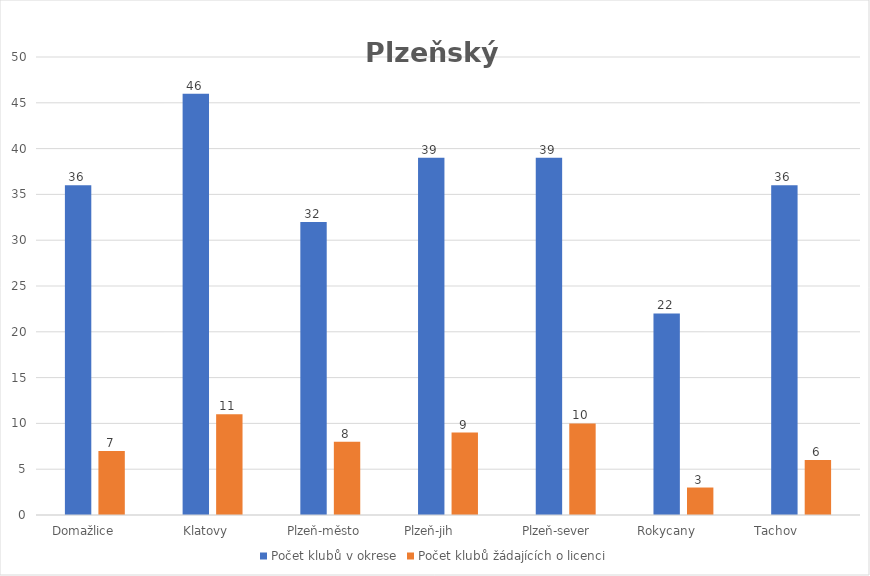
| Category | Počet klubů v okrese | Počet klubů žádajících o licenci |
|---|---|---|
| Domažlice      | 36 | 7 |
| Klatovy    | 46 | 11 |
| Plzeň-město   | 32 | 8 |
| Plzeň-jih          | 39 | 9 |
| Plzeň-sever     | 39 | 10 |
| Rokycany         | 22 | 3 |
| Tachov             | 36 | 6 |